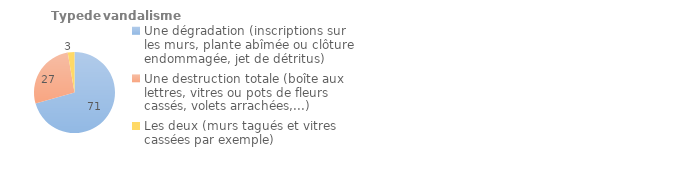
| Category | Series 0 |
|---|---|
| Une dégradation (inscriptions sur les murs, plante abîmée ou clôture endommagée, jet de détritus) | 70.592 |
| Une destruction totale (boîte aux lettres, vitres ou pots de fleurs cassés, volets arrachées,...) | 26.721 |
| Les deux (murs tagués et vitres cassées par exemple) | 2.687 |